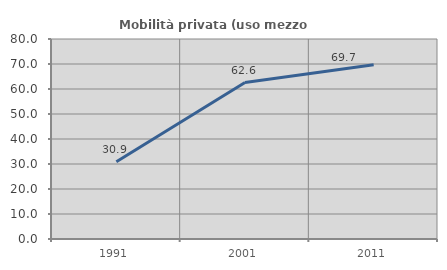
| Category | Mobilità privata (uso mezzo privato) |
|---|---|
| 1991.0 | 30.879 |
| 2001.0 | 62.57 |
| 2011.0 | 69.697 |